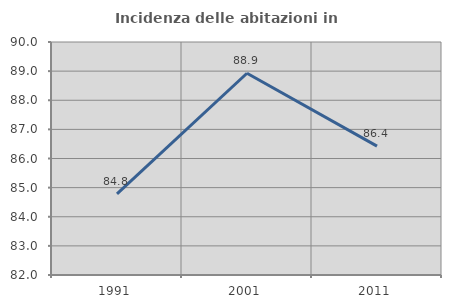
| Category | Incidenza delle abitazioni in proprietà  |
|---|---|
| 1991.0 | 84.788 |
| 2001.0 | 88.928 |
| 2011.0 | 86.425 |